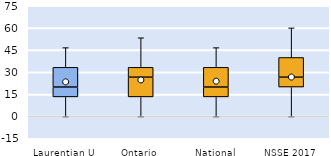
| Category | 25th | 50th | 75th |
|---|---|---|---|
| Laurentian U | 13.333 | 6.667 | 13.333 |
| Ontario | 13.333 | 13.333 | 6.667 |
| National | 13.333 | 6.667 | 13.333 |
| NSSE 2017 | 20 | 6.667 | 13.333 |